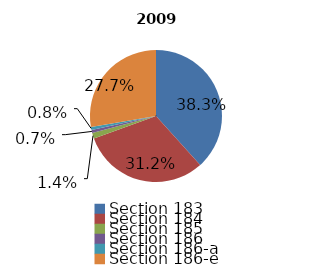
| Category | 2009 |
|---|---|
| Section 183 | 1228 |
| Section 184 | 998 |
| Section 185 | 45 |
| Section 186 | 23 |
| Section 186-a | 24 |
| Section 186-e | 886 |